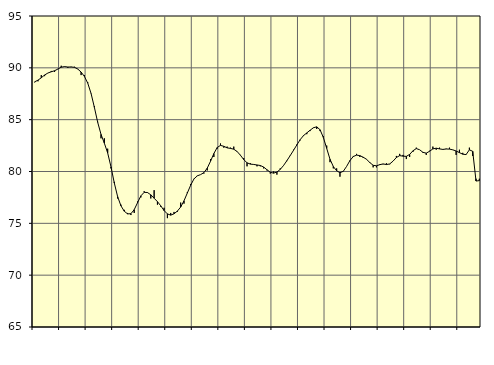
| Category | Piggar | Series 1 |
|---|---|---|
| nan | 88.6 | 88.65 |
| 87.0 | 88.7 | 88.81 |
| 87.0 | 89.3 | 89.04 |
| 87.0 | 89.2 | 89.31 |
| nan | 89.5 | 89.5 |
| 88.0 | 89.7 | 89.62 |
| 88.0 | 89.6 | 89.72 |
| 88.0 | 89.9 | 89.88 |
| nan | 90.2 | 90.06 |
| 89.0 | 90.1 | 90.12 |
| 89.0 | 90 | 90.08 |
| 89.0 | 90.1 | 90.08 |
| nan | 90.1 | 90.05 |
| 90.0 | 89.9 | 89.88 |
| 90.0 | 89.3 | 89.59 |
| 90.0 | 89.3 | 89.17 |
| nan | 88.6 | 88.52 |
| 91.0 | 87.5 | 87.53 |
| 91.0 | 86.3 | 86.18 |
| 91.0 | 84.8 | 84.74 |
| nan | 83.2 | 83.58 |
| 92.0 | 83.2 | 82.73 |
| 92.0 | 82.2 | 81.79 |
| 92.0 | 80.3 | 80.45 |
| nan | 79 | 78.89 |
| 93.0 | 77.4 | 77.58 |
| 93.0 | 76.8 | 76.69 |
| 93.0 | 76.3 | 76.17 |
| nan | 76 | 75.91 |
| 94.0 | 75.8 | 75.93 |
| 94.0 | 76 | 76.32 |
| 94.0 | 77.1 | 76.99 |
| nan | 77.5 | 77.65 |
| 95.0 | 78.1 | 77.99 |
| 95.0 | 78 | 77.97 |
| 95.0 | 77.4 | 77.75 |
| nan | 78.2 | 77.42 |
| 96.0 | 76.8 | 77.09 |
| 96.0 | 76.6 | 76.69 |
| 96.0 | 76.5 | 76.23 |
| nan | 75.5 | 75.91 |
| 97.0 | 76 | 75.79 |
| 97.0 | 76.1 | 75.92 |
| 97.0 | 76.1 | 76.18 |
| nan | 77 | 76.57 |
| 98.0 | 76.9 | 77.17 |
| 98.0 | 78 | 77.92 |
| 98.0 | 78.8 | 78.67 |
| nan | 79.3 | 79.28 |
| 99.0 | 79.6 | 79.58 |
| 99.0 | 79.7 | 79.7 |
| 99.0 | 79.8 | 79.89 |
| nan | 80.1 | 80.32 |
| 0.0 | 81.2 | 80.99 |
| 0.0 | 81.4 | 81.73 |
| 0.0 | 82.2 | 82.31 |
| nan | 82.7 | 82.52 |
| 1.0 | 82.3 | 82.43 |
| 1.0 | 82.4 | 82.28 |
| 1.0 | 82.3 | 82.23 |
| nan | 82.4 | 82.15 |
| 2.0 | 81.9 | 81.93 |
| 2.0 | 81.6 | 81.57 |
| 2.0 | 81.3 | 81.15 |
| nan | 80.5 | 80.84 |
| 3.0 | 80.8 | 80.71 |
| 3.0 | 80.7 | 80.68 |
| 3.0 | 80.5 | 80.63 |
| nan | 80.5 | 80.58 |
| 4.0 | 80.3 | 80.43 |
| 4.0 | 80.1 | 80.17 |
| 4.0 | 79.8 | 79.93 |
| nan | 80 | 79.84 |
| 5.0 | 79.7 | 79.95 |
| 5.0 | 80.3 | 80.2 |
| 5.0 | 80.6 | 80.58 |
| nan | 81 | 81.04 |
| 6.0 | 81.5 | 81.53 |
| 6.0 | 82.1 | 82.04 |
| 6.0 | 82.6 | 82.56 |
| nan | 83 | 83.07 |
| 7.0 | 83.5 | 83.46 |
| 7.0 | 83.6 | 83.72 |
| 7.0 | 83.9 | 83.98 |
| nan | 84.2 | 84.22 |
| 8.0 | 84.1 | 84.31 |
| 8.0 | 83.9 | 84.03 |
| 8.0 | 83.4 | 83.28 |
| nan | 82.5 | 82.23 |
| 9.0 | 80.9 | 81.18 |
| 9.0 | 80.3 | 80.48 |
| 9.0 | 80.3 | 80.07 |
| nan | 79.5 | 79.88 |
| 10.0 | 80 | 80.02 |
| 10.0 | 80.5 | 80.49 |
| 10.0 | 81 | 81.05 |
| nan | 81.5 | 81.44 |
| 11.0 | 81.7 | 81.58 |
| 11.0 | 81.4 | 81.53 |
| 11.0 | 81.3 | 81.38 |
| nan | 81.2 | 81.18 |
| 12.0 | 80.9 | 80.86 |
| 12.0 | 80.4 | 80.6 |
| 12.0 | 80.4 | 80.55 |
| nan | 80.7 | 80.66 |
| 13.0 | 80.7 | 80.73 |
| 13.0 | 80.8 | 80.67 |
| 13.0 | 80.7 | 80.73 |
| nan | 81 | 81 |
| 14.0 | 81.5 | 81.35 |
| 14.0 | 81.7 | 81.53 |
| 14.0 | 81.6 | 81.48 |
| nan | 81.2 | 81.46 |
| 15.0 | 81.4 | 81.65 |
| 15.0 | 81.9 | 82 |
| 15.0 | 82.3 | 82.21 |
| nan | 82.1 | 82.1 |
| 16.0 | 81.8 | 81.85 |
| 16.0 | 81.6 | 81.77 |
| 16.0 | 82 | 81.95 |
| nan | 82.4 | 82.18 |
| 17.0 | 82.1 | 82.25 |
| 17.0 | 82.3 | 82.18 |
| 17.0 | 82.1 | 82.13 |
| nan | 82.2 | 82.17 |
| 18.0 | 82.3 | 82.16 |
| 18.0 | 82.1 | 82.09 |
| 18.0 | 81.6 | 81.98 |
| nan | 82.1 | 81.82 |
| 19.0 | 81.8 | 81.67 |
| 19.0 | 81.6 | 81.63 |
| 19.0 | 82.3 | 82.09 |
| nan | 81.5 | 81.95 |
| 20.0 | 79.3 | 79.08 |
| 20.0 | 79.3 | 79.12 |